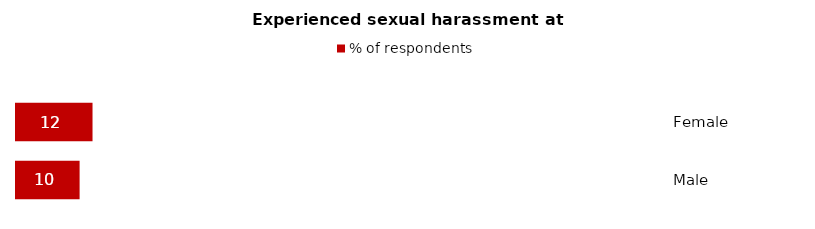
| Category | % of respondents |
|---|---|
| Female | 12 |
| Male | 10 |